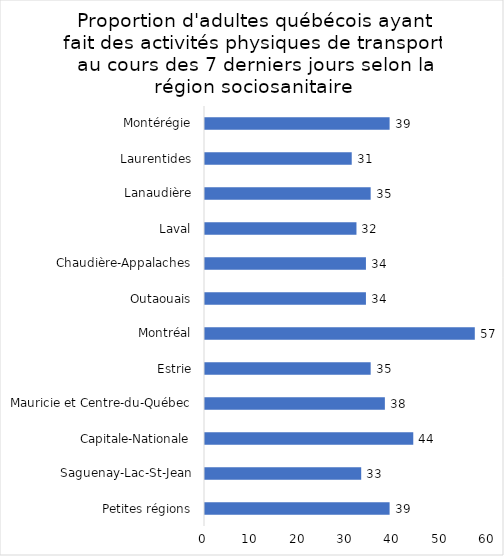
| Category | Series 0 |
|---|---|
| Petites régions | 39 |
| Saguenay-Lac-St-Jean | 33 |
| Capitale-Nationale | 44 |
| Mauricie et Centre-du-Québec | 38 |
| Estrie | 35 |
| Montréal | 57 |
| Outaouais | 34 |
| Chaudière-Appalaches | 34 |
| Laval | 32 |
| Lanaudière | 35 |
| Laurentides | 31 |
| Montérégie | 39 |